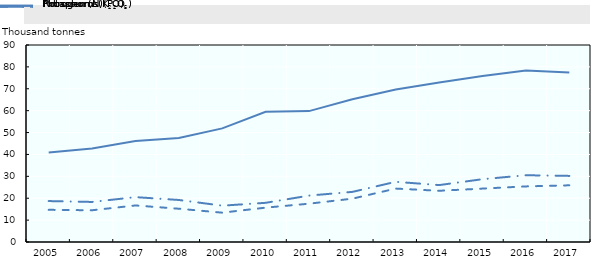
| Category | Nitrogen (N) | Phosphorus (P2O5) | Potassium (K2O) |
|---|---|---|---|
| 2005.0 | 40.9 | 14.7 | 18.7 |
| 2006.0 | 42.7 | 14.5 | 18.3 |
| 2007.0 | 46.1 | 16.7 | 20.5 |
| 2008.0 | 47.5 | 15.2 | 19.2 |
| 2009.0 | 51.9 | 13.4 | 16.6 |
| 2010.0 | 59.5 | 15.7 | 17.9 |
| 2011.0 | 59.8 | 17.5 | 21.2 |
| 2012.0 | 65.2 | 19.8 | 22.9 |
| 2013.0 | 69.7 | 24.4 | 27.5 |
| 2014.0 | 72.9 | 23.4 | 26 |
| 2015.0 | 75.8 | 24.4 | 28.7 |
| 2016.0 | 78.3 | 25.4 | 30.5 |
| 2017.0 | 77.4 | 25.9 | 30.2 |